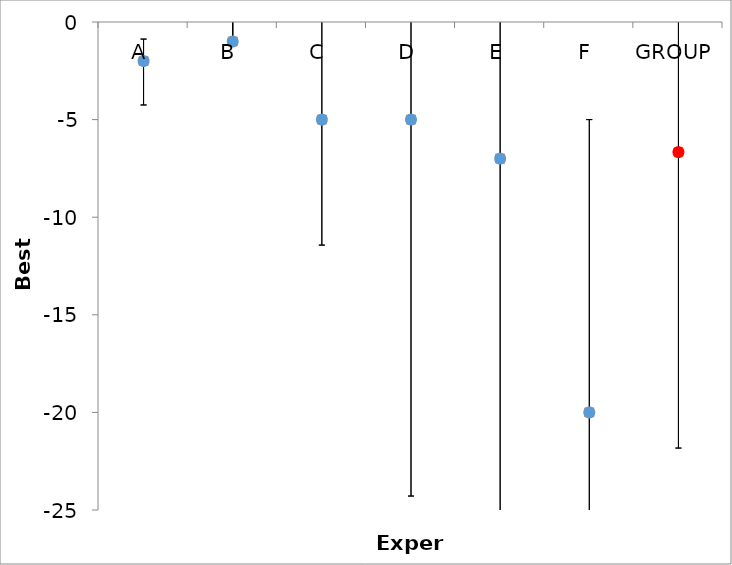
| Category | Series 1 | Series 0 |
|---|---|---|
| A | -2 | -2 |
| B | -1 | -1 |
| C | -5 | -5 |
| D | -5 | -5 |
| E | -7 | -7 |
| F | -20 | -20 |
| GROUP | -6.667 | -6.667 |